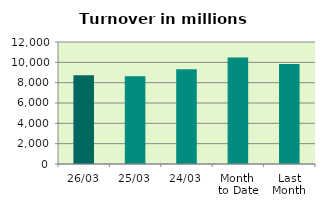
| Category | Series 0 |
|---|---|
| 26/03 | 8725.585 |
| 25/03 | 8640.995 |
| 24/03 | 9319.794 |
| Month 
to Date | 10466.578 |
| Last
Month | 9824.278 |